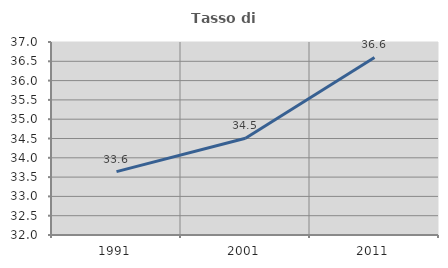
| Category | Tasso di occupazione   |
|---|---|
| 1991.0 | 33.642 |
| 2001.0 | 34.506 |
| 2011.0 | 36.599 |